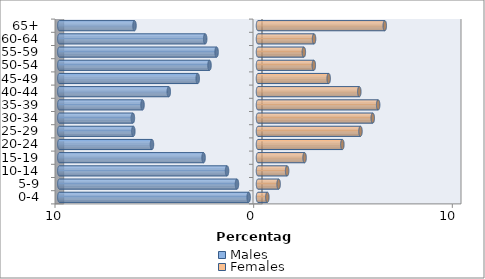
| Category | Males | Females |
|---|---|---|
| 0-4 | -0.47 | 0.47 |
| 5-9 | -1.059 | 1.039 |
| 10-14 | -1.559 | 1.466 |
| 15-19 | -2.74 | 2.345 |
| 20-24 | -5.337 | 4.246 |
| 25-29 | -6.275 | 5.157 |
| 30-34 | -6.298 | 5.776 |
| 35-39 | -5.813 | 6.048 |
| 40-44 | -4.49 | 5.099 |
| 45-49 | -3.033 | 3.558 |
| 50-54 | -2.441 | 2.809 |
| 55-59 | -2.084 | 2.307 |
| 60-64 | -2.659 | 2.821 |
| 65+ | -6.217 | 6.382 |